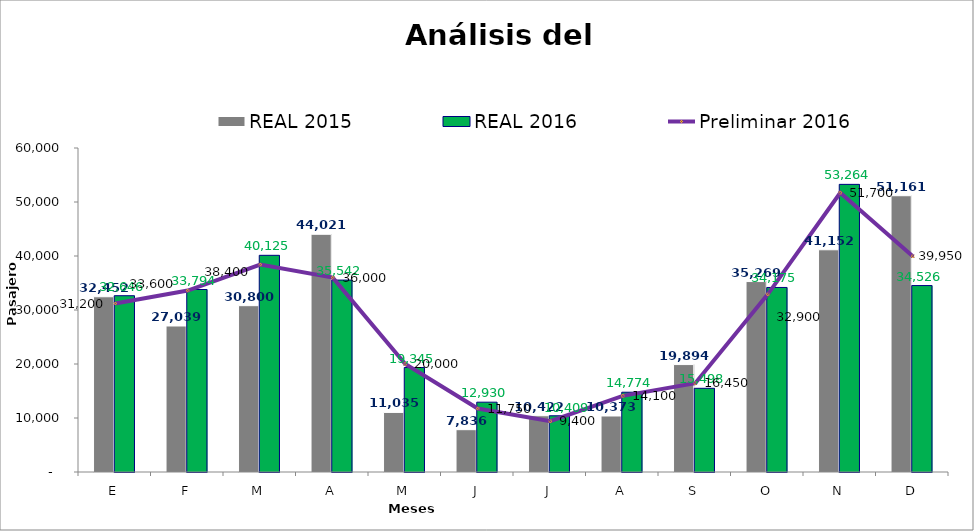
| Category | REAL 2015 | REAL 2016 |
|---|---|---|
| E | 32452 | 32646 |
| F | 27039 | 33794 |
| M | 30800 | 40125 |
| A | 44021 | 35542 |
| M | 11035 | 19345 |
| J | 7836 | 12930 |
| J | 10422 | 10409 |
| A | 10373 | 14774 |
| S | 19894 | 15498 |
| O | 35269 | 34175 |
| N | 41152 | 53264 |
| D | 51161 | 34526 |